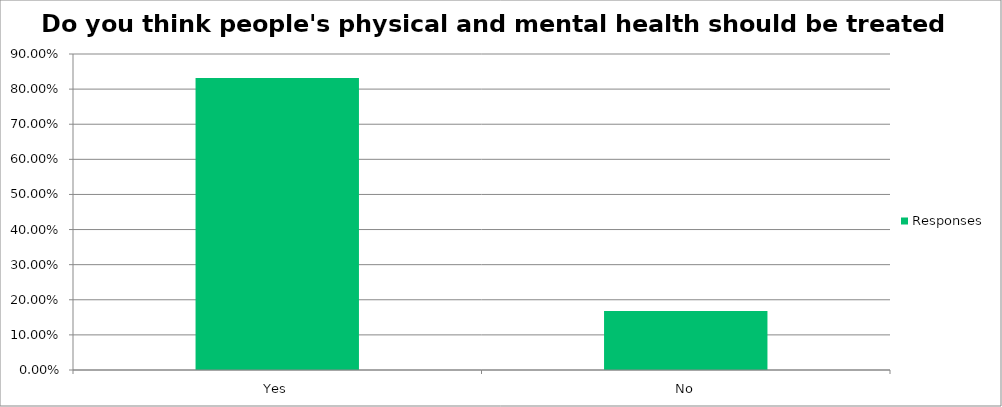
| Category | Responses |
|---|---|
| Yes | 0.832 |
| No | 0.168 |